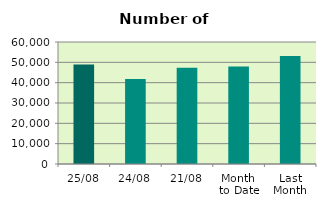
| Category | Series 0 |
|---|---|
| 25/08 | 48890 |
| 24/08 | 41830 |
| 21/08 | 47290 |
| Month 
to Date | 47980.353 |
| Last
Month | 53071.913 |